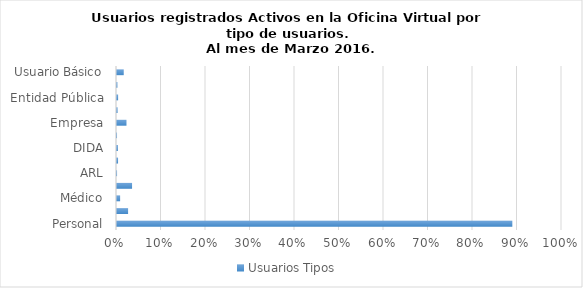
| Category | Usuarios Tipos |
|---|---|
| Personal | 0.888 |
| Promotor | 0.025 |
| Médico | 0.007 |
| ARS | 0.034 |
| ARL | 0 |
| SISALRIL | 0.002 |
| DIDA | 0.002 |
| TSS | 0 |
| Empresa | 0.021 |
| PSS | 0.001 |
| Entidad Pública | 0.003 |
| AEI | 0.001 |
| Usuario Básico | 0.015 |